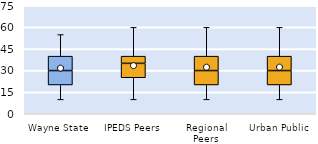
| Category | 25th | 50th | 75th |
|---|---|---|---|
| Wayne State | 20 | 10 | 10 |
| IPEDS Peers | 25 | 10 | 5 |
| Regional Peers | 20 | 10 | 10 |
| Urban Public | 20 | 10 | 10 |